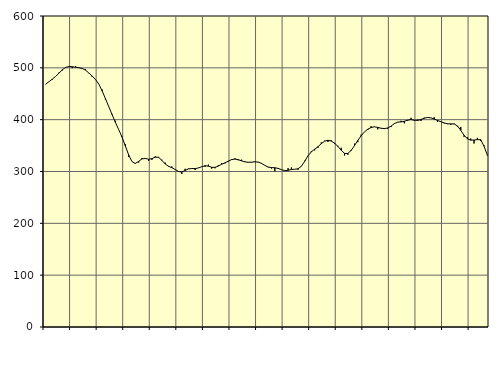
| Category | Piggar | Series 1 |
|---|---|---|
| nan | 468.3 | 468.64 |
| 87.0 | 473.2 | 473.27 |
| 87.0 | 477.1 | 478.19 |
| 87.0 | 483.4 | 483.36 |
| nan | 490.8 | 489.68 |
| 88.0 | 494.7 | 496.19 |
| 88.0 | 501.2 | 500.78 |
| 88.0 | 502.7 | 502.53 |
| nan | 499.3 | 502.12 |
| 89.0 | 503.5 | 501.16 |
| 89.0 | 499.8 | 500.27 |
| 89.0 | 499.3 | 498.77 |
| nan | 497.6 | 495.47 |
| 90.0 | 489.7 | 490.11 |
| 90.0 | 482.4 | 484.08 |
| 90.0 | 477.3 | 477.71 |
| nan | 468.5 | 468.56 |
| 91.0 | 458 | 455.62 |
| 91.0 | 438.8 | 440.61 |
| 91.0 | 425.5 | 425.21 |
| nan | 411 | 409.83 |
| 92.0 | 397.8 | 394.76 |
| 92.0 | 380.7 | 380.79 |
| 92.0 | 367.4 | 366.3 |
| nan | 352.6 | 349.25 |
| 93.0 | 328.4 | 331.86 |
| 93.0 | 319 | 319.08 |
| 93.0 | 314.9 | 315.53 |
| nan | 317.2 | 319.54 |
| 94.0 | 326.1 | 324.34 |
| 94.0 | 326.1 | 325.11 |
| 94.0 | 320.3 | 323.64 |
| nan | 322.6 | 324.79 |
| 95.0 | 329.4 | 327.69 |
| 95.0 | 328.2 | 327.28 |
| 95.0 | 322.7 | 321.52 |
| nan | 317.1 | 314.54 |
| 96.0 | 309.4 | 310.06 |
| 96.0 | 309.7 | 307.35 |
| 96.0 | 304.1 | 303.87 |
| nan | 300.6 | 299.99 |
| 97.0 | 295.4 | 299.1 |
| 97.0 | 305.3 | 301.93 |
| 97.0 | 305.7 | 304.98 |
| nan | 306.2 | 305.72 |
| 98.0 | 302.9 | 305.65 |
| 98.0 | 307 | 306.85 |
| 98.0 | 309.4 | 309.2 |
| nan | 309 | 311.21 |
| 99.0 | 313.3 | 310.31 |
| 99.0 | 305.6 | 308.15 |
| 99.0 | 306.2 | 307.92 |
| nan | 312.2 | 310.54 |
| 0.0 | 316.4 | 313.99 |
| 0.0 | 315.7 | 316.63 |
| 0.0 | 318.9 | 320.03 |
| nan | 323.8 | 323.02 |
| 1.0 | 325.5 | 323.99 |
| 1.0 | 321.6 | 322.84 |
| 1.0 | 322.8 | 320.55 |
| nan | 319.3 | 318.61 |
| 2.0 | 318.2 | 317.76 |
| 2.0 | 317.4 | 317.99 |
| 2.0 | 319.2 | 318.65 |
| nan | 318.4 | 318.16 |
| 3.0 | 315 | 315.73 |
| 3.0 | 311.8 | 311.75 |
| 3.0 | 308 | 308.57 |
| nan | 305.7 | 307.58 |
| 4.0 | 300.3 | 307.25 |
| 4.0 | 304.8 | 306.07 |
| 4.0 | 303.2 | 303.57 |
| nan | 302.6 | 301.65 |
| 5.0 | 306.5 | 302.21 |
| 5.0 | 307.8 | 303.84 |
| 5.0 | 304.4 | 304.35 |
| nan | 303.3 | 305.25 |
| 6.0 | 309.8 | 310.14 |
| 6.0 | 320.8 | 319.67 |
| 6.0 | 330.7 | 330.3 |
| nan | 339.5 | 337.97 |
| 7.0 | 340.7 | 342.98 |
| 7.0 | 345.6 | 347.82 |
| 7.0 | 356.2 | 353.62 |
| nan | 359.4 | 358.57 |
| 8.0 | 356.9 | 360.25 |
| 8.0 | 360.4 | 358.8 |
| 8.0 | 353 | 354.66 |
| nan | 349.6 | 348.44 |
| 9.0 | 345.7 | 340.89 |
| 9.0 | 330.8 | 334.98 |
| 9.0 | 332.3 | 334.72 |
| nan | 339.6 | 340.75 |
| 10.0 | 353.7 | 350.02 |
| 10.0 | 356.6 | 359.98 |
| 10.0 | 371.2 | 368.96 |
| nan | 376.6 | 376.46 |
| 11.0 | 380 | 381.64 |
| 11.0 | 387.4 | 384.91 |
| 11.0 | 385.9 | 386.21 |
| nan | 381.3 | 385.11 |
| 12.0 | 383 | 383.48 |
| 12.0 | 383.7 | 382.77 |
| 12.0 | 382.6 | 383.99 |
| nan | 385.7 | 387.49 |
| 13.0 | 393.1 | 392.34 |
| 13.0 | 395.6 | 395.27 |
| 13.0 | 397.8 | 395.64 |
| nan | 393 | 396.81 |
| 14.0 | 397.9 | 399.08 |
| 14.0 | 403.5 | 400.08 |
| 14.0 | 397.5 | 399 |
| nan | 400.2 | 398.5 |
| 15.0 | 397.5 | 400.34 |
| 15.0 | 403.8 | 402.82 |
| 15.0 | 403.8 | 404.24 |
| nan | 403.4 | 403.53 |
| 16.0 | 404.7 | 401.1 |
| 16.0 | 396 | 398.51 |
| 16.0 | 395.7 | 396.08 |
| nan | 393.1 | 393.66 |
| 17.0 | 391.4 | 392.06 |
| 17.0 | 389.9 | 391.87 |
| 17.0 | 392.5 | 391.76 |
| nan | 386.5 | 387.97 |
| 18.0 | 385.9 | 379.38 |
| 18.0 | 366.8 | 369.82 |
| 18.0 | 366.4 | 363.04 |
| nan | 363.5 | 360.49 |
| 19.0 | 354.1 | 360.7 |
| 19.0 | 365 | 361.5 |
| 19.0 | 358.7 | 361.29 |
| nan | 350.5 | 348.76 |
| 20.0 | 330.8 | 331.87 |